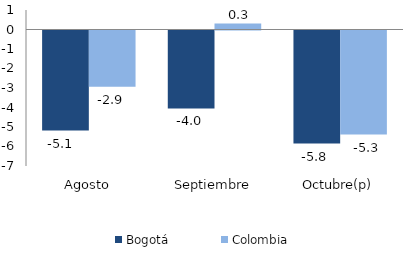
| Category | Bogotá | Colombia |
|---|---|---|
| Agosto | -5.134 | -2.888 |
| Septiembre | -3.998 | 0.304 |
| Octubre(p) | -5.799 | -5.338 |